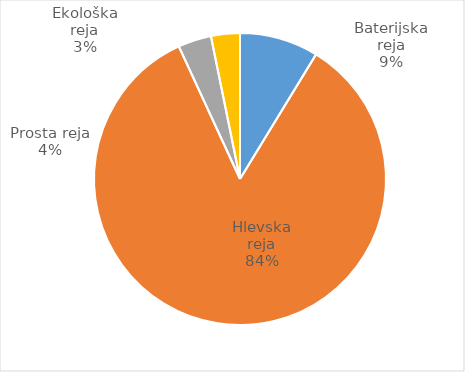
| Category | Število kosov jajc |
|---|---|
| Baterijska reja | 278486 |
| Hlevska reja | 2693997 |
| Prosta reja | 117654 |
| Ekološka reja | 102068 |